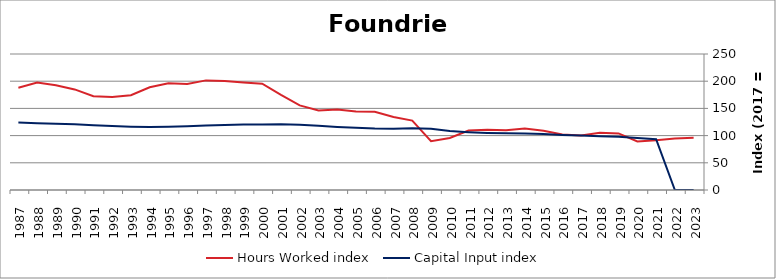
| Category | Hours Worked index | Capital Input index |
|---|---|---|
| 2023.0 | 96.06 | 0 |
| 2022.0 | 94.759 | 0 |
| 2021.0 | 91.371 | 93.371 |
| 2020.0 | 89.277 | 95.677 |
| 2019.0 | 104.086 | 97.905 |
| 2018.0 | 105.064 | 99.03 |
| 2017.0 | 100 | 100 |
| 2016.0 | 102.235 | 101.208 |
| 2015.0 | 108.963 | 103.097 |
| 2014.0 | 113.046 | 103.993 |
| 2013.0 | 109.667 | 104.396 |
| 2012.0 | 110.93 | 105.007 |
| 2011.0 | 109.389 | 106.33 |
| 2010.0 | 95.588 | 108.333 |
| 2009.0 | 89.827 | 112.558 |
| 2008.0 | 127.537 | 113.392 |
| 2007.0 | 134.091 | 112.58 |
| 2006.0 | 143.932 | 113.074 |
| 2005.0 | 144.328 | 114.417 |
| 2004.0 | 148.153 | 115.899 |
| 2003.0 | 146.129 | 117.986 |
| 2002.0 | 155.619 | 120.005 |
| 2001.0 | 174.672 | 120.987 |
| 2000.0 | 195.315 | 120.59 |
| 1999.0 | 197.786 | 120.296 |
| 1998.0 | 200.482 | 119.589 |
| 1997.0 | 201.5 | 118.463 |
| 1996.0 | 194.955 | 117.092 |
| 1995.0 | 196.278 | 116.363 |
| 1994.0 | 188.928 | 115.844 |
| 1993.0 | 174.312 | 116.304 |
| 1992.0 | 170.758 | 117.498 |
| 1991.0 | 172.285 | 119.149 |
| 1990.0 | 184.915 | 120.738 |
| 1989.0 | 192.67 | 121.872 |
| 1988.0 | 197.551 | 122.897 |
| 1987.0 | 187.958 | 124.137 |